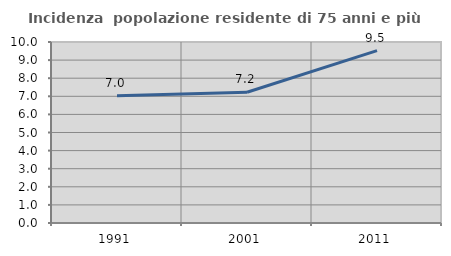
| Category | Incidenza  popolazione residente di 75 anni e più |
|---|---|
| 1991.0 | 7.027 |
| 2001.0 | 7.226 |
| 2011.0 | 9.521 |